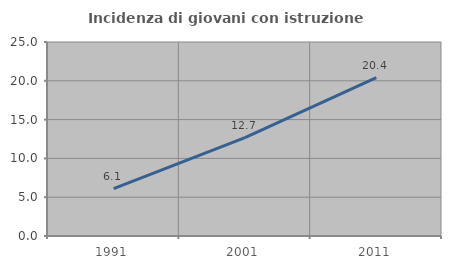
| Category | Incidenza di giovani con istruzione universitaria |
|---|---|
| 1991.0 | 6.098 |
| 2001.0 | 12.676 |
| 2011.0 | 20.408 |